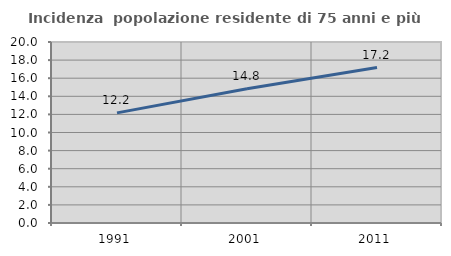
| Category | Incidenza  popolazione residente di 75 anni e più |
|---|---|
| 1991.0 | 12.169 |
| 2001.0 | 14.835 |
| 2011.0 | 17.172 |